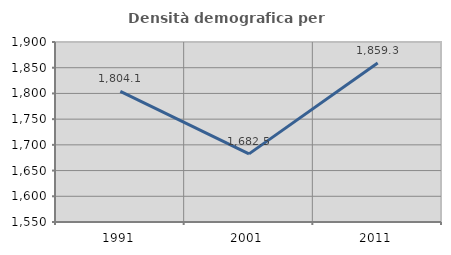
| Category | Densità demografica |
|---|---|
| 1991.0 | 1804.055 |
| 2001.0 | 1682.472 |
| 2011.0 | 1859.32 |